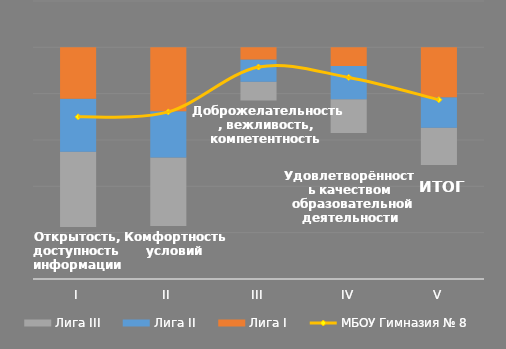
| Category | пустота | Лига III | Лига II | Лига I |
|---|---|---|---|---|
| I | 0.225 | 0.324 | 0.229 | 0.222 |
| II | 0.229 | 0.296 | 0.2 | 0.276 |
| III | 0.77 | 0.082 | 0.096 | 0.052 |
| IV | 0.63 | 0.146 | 0.143 | 0.081 |
| V | 0.492 | 0.161 | 0.131 | 0.216 |